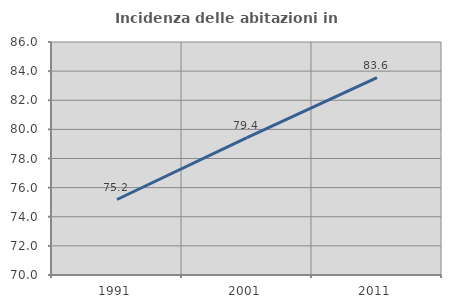
| Category | Incidenza delle abitazioni in proprietà  |
|---|---|
| 1991.0 | 75.184 |
| 2001.0 | 79.432 |
| 2011.0 | 83.551 |